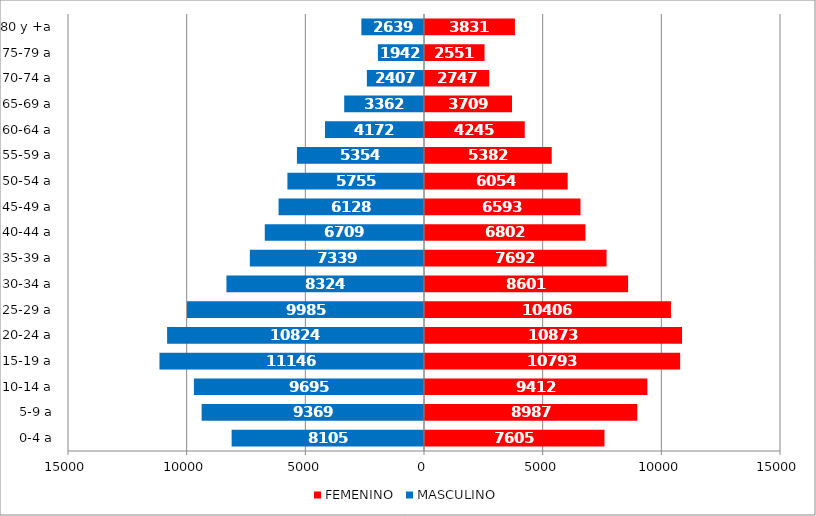
| Category | FEMENINO | MASCULINO |
|---|---|---|
| 0-4 a | 7605 | -8105 |
| 5-9 a | 8987 | -9369 |
| 10-14 a | 9412 | -9695 |
| 15-19 a | 10793 | -11146 |
| 20-24 a | 10873 | -10824 |
| 25-29 a | 10406 | -9985 |
| 30-34 a | 8601 | -8324 |
| 35-39 a | 7692 | -7339 |
| 40-44 a | 6802 | -6709 |
| 45-49 a | 6593 | -6128 |
| 50-54 a | 6054 | -5755 |
| 55-59 a | 5382 | -5354 |
| 60-64 a | 4245 | -4172 |
| 65-69 a | 3709 | -3362 |
| 70-74 a | 2747 | -2407 |
| 75-79 a | 2551 | -1942 |
| 80 y +a | 3831 | -2639 |